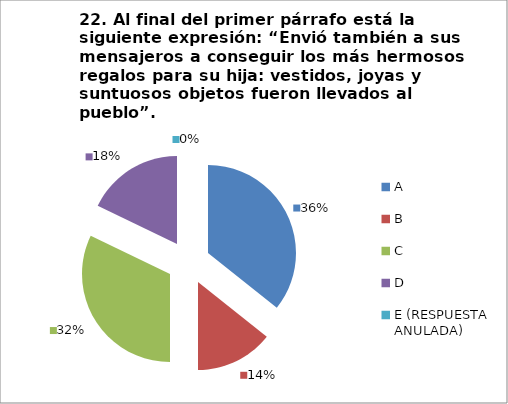
| Category | CANTIDAD DE RESPUESTAS PREGUNTA (22) | PORCENTAJE |
|---|---|---|
| A | 10 | 0.357 |
| B | 4 | 0.143 |
| C | 9 | 0.321 |
| D | 5 | 0.179 |
| E (RESPUESTA ANULADA) | 0 | 0 |